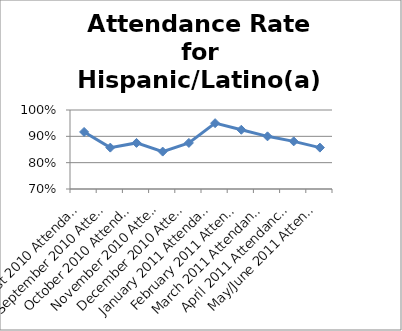
| Category | Attendance Rate for Hispanic/Latino(a) Students |
|---|---|
| August 2010 Attendance Rate | 0.917 |
| September 2010 Attendance Rate | 0.857 |
| October 2010 Attendance Rate | 0.875 |
| November 2010 Attendance Rate | 0.842 |
| December 2010 Attendance Rate | 0.875 |
| January 2011 Attendance Rate | 0.95 |
| February 2011 Attendance Rate | 0.925 |
| March 2011 Attendance Rate | 0.9 |
| April 2011 Attendance Rate | 0.881 |
| May/June 2011 Attendance Rate | 0.857 |